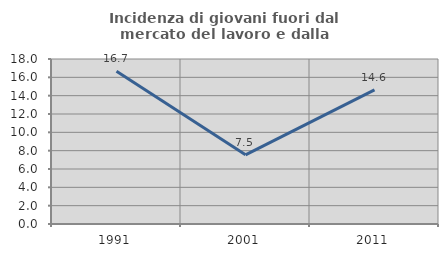
| Category | Incidenza di giovani fuori dal mercato del lavoro e dalla formazione  |
|---|---|
| 1991.0 | 16.667 |
| 2001.0 | 7.547 |
| 2011.0 | 14.634 |